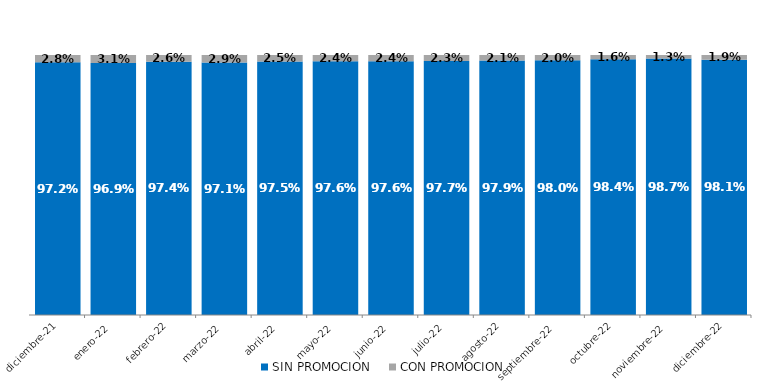
| Category | SIN PROMOCION   | CON PROMOCION   |
|---|---|---|
| 2021-12-01 | 0.972 | 0.028 |
| 2022-01-01 | 0.969 | 0.031 |
| 2022-02-01 | 0.974 | 0.026 |
| 2022-03-01 | 0.971 | 0.029 |
| 2022-04-01 | 0.975 | 0.025 |
| 2022-05-01 | 0.976 | 0.024 |
| 2022-06-01 | 0.976 | 0.024 |
| 2022-07-01 | 0.977 | 0.023 |
| 2022-08-01 | 0.979 | 0.021 |
| 2022-09-01 | 0.98 | 0.02 |
| 2022-10-01 | 0.984 | 0.016 |
| 2022-11-01 | 0.987 | 0.013 |
| 2022-12-01 | 0.981 | 0.019 |